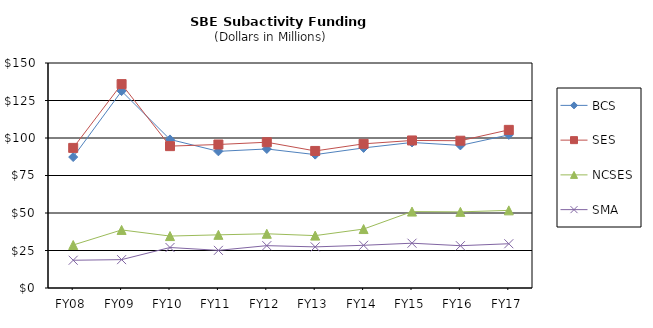
| Category | BCS | SES | NCSES | SMA |
|---|---|---|---|---|
| FY08 | 87.3 | 93.4 | 28.66 | 18.51 |
| FY09 | 131.28 | 135.92 | 38.71 | 18.91 |
| FY10 | 99.05 | 94.58 | 34.62 | 27 |
| FY11 | 91.114 | 95.676 | 35.439 | 25.096 |
| FY12 | 92.69 | 97.18 | 36.15 | 28.23 |
| FY13 | 88.92 | 91.37 | 34.92 | 27.41 |
| FY14 | 93.39 | 96.11 | 39.3 | 28.47 |
| FY15 | 97.031 | 98.358 | 50.941 | 29.856 |
| FY16 | 95.06 | 98.18 | 50.76 | 28.2 |
| FY17 | 102.08 | 105.42 | 51.76 | 29.51 |